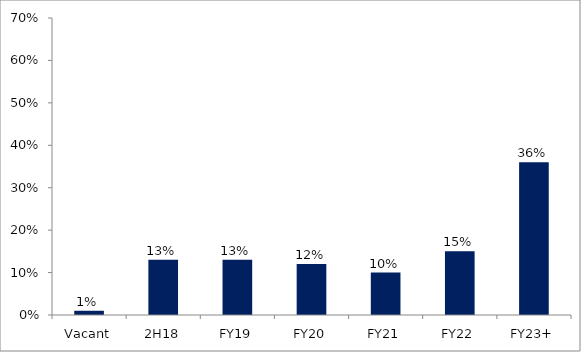
| Category | Series 0 |
|---|---|
| Vacant | 0.01 |
| 2H18 | 0.13 |
| FY19 | 0.13 |
| FY20 | 0.12 |
| FY21 | 0.1 |
| FY22 | 0.15 |
| FY23+ | 0.36 |